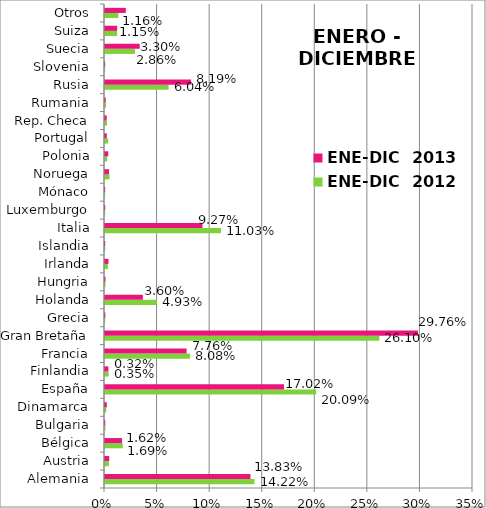
| Category | ENE-DIC  2012 | ENE-DIC  2013 |
|---|---|---|
| Alemania | 0.142 | 0.138 |
| Austria | 0.004 | 0.004 |
| Bélgica | 0.017 | 0.016 |
| Bulgaria | 0 | 0 |
| Dinamarca | 0.001 | 0.002 |
| España | 0.201 | 0.17 |
| Finlandia | 0.003 | 0.003 |
| Francia | 0.081 | 0.078 |
| Gran Bretaña | 0.261 | 0.298 |
| Grecia | 0 | 0 |
| Holanda | 0.049 | 0.036 |
| Hungria | 0.001 | 0 |
| Irlanda | 0.003 | 0.003 |
| Islandia | 0 | 0 |
| Italia | 0.11 | 0.093 |
| Luxemburgo | 0 | 0 |
| Mónaco | 0 | 0 |
| Noruega | 0.004 | 0.004 |
| Polonia | 0.002 | 0.003 |
| Portugal | 0.003 | 0.002 |
| Rep. Checa | 0.002 | 0.002 |
| Rumania | 0.001 | 0.001 |
| Rusia | 0.06 | 0.082 |
| Slovenia | 0 | 0 |
| Suecia | 0.029 | 0.033 |
| Suiza | 0.012 | 0.012 |
| Otros | 0.013 | 0.02 |